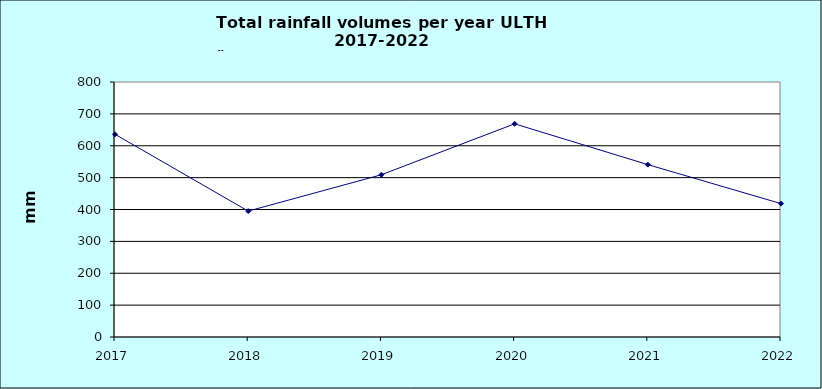
| Category | Series 0 |
|---|---|
| 2017.0 | 636 |
| 2018.0 | 395 |
| 2019.0 | 509 |
| 2020.0 | 668.8 |
| 2021.0 | 540.8 |
| 2022.0 | 418.5 |